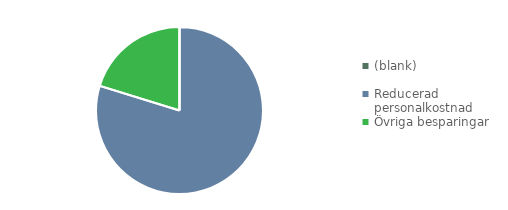
| Category | Summa |
|---|---|
| (blank) | 0 |
| Reducerad personalkostnad | 5105 |
| Övriga besparingar | 1295 |